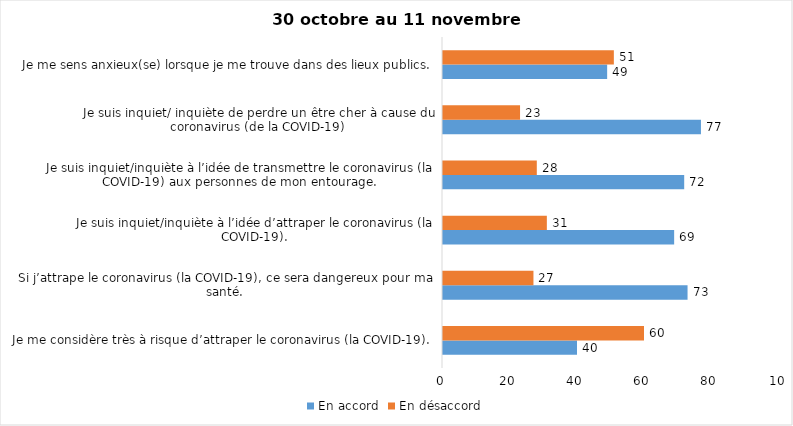
| Category | En accord | En désaccord |
|---|---|---|
| Je me considère très à risque d’attraper le coronavirus (la COVID-19). | 40 | 60 |
| Si j’attrape le coronavirus (la COVID-19), ce sera dangereux pour ma santé. | 73 | 27 |
| Je suis inquiet/inquiète à l’idée d’attraper le coronavirus (la COVID-19). | 69 | 31 |
| Je suis inquiet/inquiète à l’idée de transmettre le coronavirus (la COVID-19) aux personnes de mon entourage. | 72 | 28 |
| Je suis inquiet/ inquiète de perdre un être cher à cause du coronavirus (de la COVID-19) | 77 | 23 |
| Je me sens anxieux(se) lorsque je me trouve dans des lieux publics. | 49 | 51 |